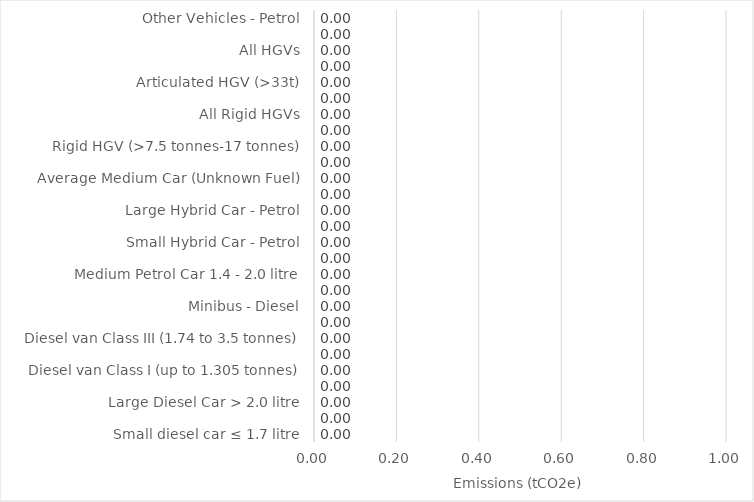
| Category | Emissions
(tCO2e) |
|---|---|
| Small diesel car ≤ 1.7 litre | 0 |
| Medium diesel car, 1.7 - 2.0 litre | 0 |
| Large Diesel Car > 2.0 litre | 0 |
| MPV - Diesel | 0 |
| Diesel van Class I (up to 1.305 tonnes) | 0 |
| Diesel van Class II (1.305 to 1.74 tonnes) | 0 |
| Diesel van Class III (1.74 to 3.5 tonnes) | 0 |
| Diesel 4x4 | 0 |
| Minibus - Diesel | 0 |
| Small Petrol Cars  ≤ 1.4 litre | 0 |
| Medium Petrol Car 1.4 - 2.0 litre | 0 |
| Large Petrol Car > 2.0 litre | 0 |
| Small Hybrid Car - Petrol | 0 |
| Medium Hybrid Car - Petrol | 0 |
| Large Hybrid Car - Petrol | 0 |
| Electric Vehicle (Average Sized Car) | 0 |
| Average Medium Car (Unknown Fuel) | 0 |
| Rigid HGV (>3.5 - 7.5 tonnes) | 0 |
| Rigid HGV (>7.5 tonnes-17 tonnes) | 0 |
| Rigid HGV (>17 tonnes) | 0 |
| All Rigid HGVs | 0 |
| Articulated HGV (>3.5 - 33t) | 0 |
| Articulated HGV (>33t) | 0 |
| All Articulated HGVs | 0 |
| All HGVs | 0 |
| Other Vehicles - Diesel | 0 |
| Other Vehicles - Petrol | 0 |